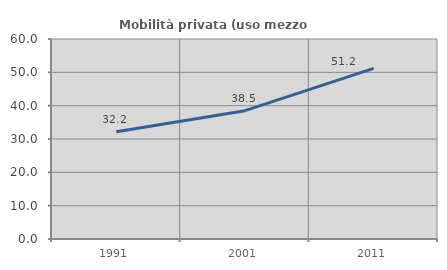
| Category | Mobilità privata (uso mezzo privato) |
|---|---|
| 1991.0 | 32.192 |
| 2001.0 | 38.496 |
| 2011.0 | 51.168 |